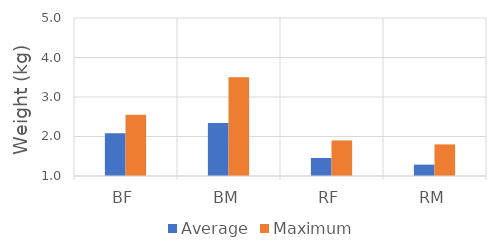
| Category | Average | Maximum |
|---|---|---|
| BF | 2.083 | 2.55 |
| BM | 2.339 | 3.5 |
| RF | 1.456 | 1.9 |
| RM | 1.287 | 1.8 |